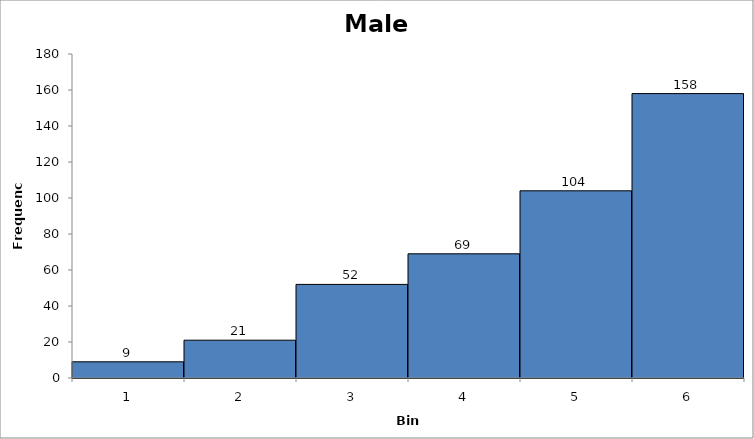
| Category | Series 1 |
|---|---|
| 0 | 9 |
| 1 | 21 |
| 2 | 52 |
| 3 | 69 |
| 4 | 104 |
| 5 | 158 |